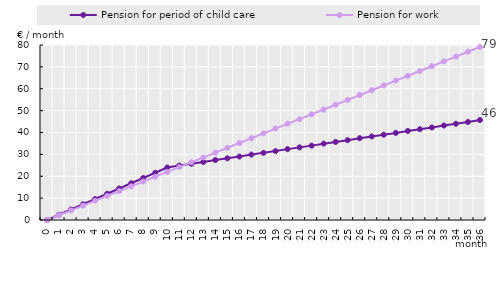
| Category | Pension for period of child care | Pension for work |
|---|---|---|
| 0.0 | 0 | 0 |
| 1.0 | 2.4 | 2.2 |
| 2.0 | 4.8 | 4.4 |
| 3.0 | 7.2 | 6.6 |
| 4.0 | 9.6 | 8.8 |
| 5.0 | 12 | 11 |
| 6.0 | 14.4 | 13.2 |
| 7.0 | 16.8 | 15.4 |
| 8.0 | 19.2 | 17.6 |
| 9.0 | 21.6 | 19.8 |
| 10.0 | 24 | 22 |
| 11.0 | 24.9 | 24.2 |
| 12.0 | 25.7 | 26.4 |
| 13.0 | 26.5 | 28.6 |
| 14.0 | 27.4 | 30.8 |
| 15.0 | 28.2 | 33 |
| 16.0 | 29 | 35.2 |
| 17.0 | 29.9 | 37.4 |
| 18.0 | 30.7 | 39.6 |
| 19.0 | 31.5 | 41.8 |
| 20.0 | 32.4 | 44 |
| 21.0 | 33.2 | 46.1 |
| 22.0 | 34 | 48.3 |
| 23.0 | 34.9 | 50.5 |
| 24.0 | 35.7 | 52.7 |
| 25.0 | 36.5 | 54.9 |
| 26.0 | 37.4 | 57.1 |
| 27.0 | 38.2 | 59.3 |
| 28.0 | 39 | 61.5 |
| 29.0 | 39.8 | 63.7 |
| 30.0 | 40.7 | 65.9 |
| 31.0 | 41.5 | 68.1 |
| 32.0 | 42.3 | 70.3 |
| 33.0 | 43.2 | 72.5 |
| 34.0 | 44 | 74.7 |
| 35.0 | 44.8 | 76.9 |
| 36.0 | 45.7 | 79.1 |